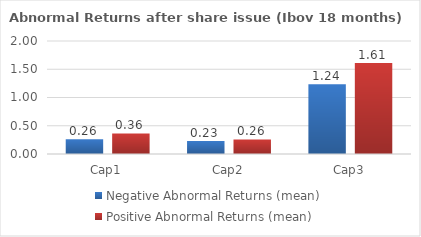
| Category | Negative Abnormal Returns (mean) | Positive Abnormal Returns (mean) |
|---|---|---|
| Cap1 | 0.262 | 0.364 |
| Cap2 | 0.229 | 0.257 |
| Cap3 | 1.236 | 1.611 |